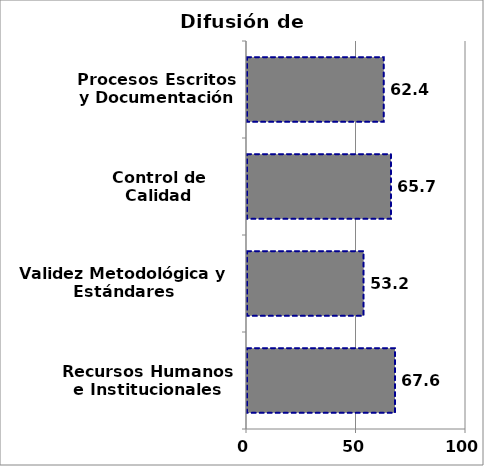
| Category | Series 0 |
|---|---|
| Recursos Humanos e Institucionales | 67.593 |
| Validez Metodológica y Estándares Internacionales | 53.241 |
| Control de Calidad | 65.7 |
| Procesos Escritos y Documentación | 62.434 |